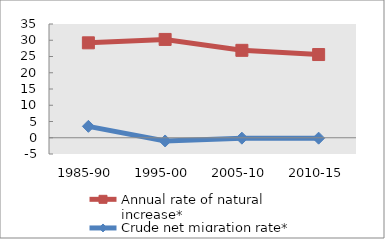
| Category | Annual rate of natural increase* | Crude net migration rate* |
|---|---|---|
| 1985-90 | 29.207 | 3.513 |
| 1995-00 | 30.252 | -0.993 |
| 2005-10 | 26.897 | -0.123 |
| 2010-15 | 25.601 | -0.129 |